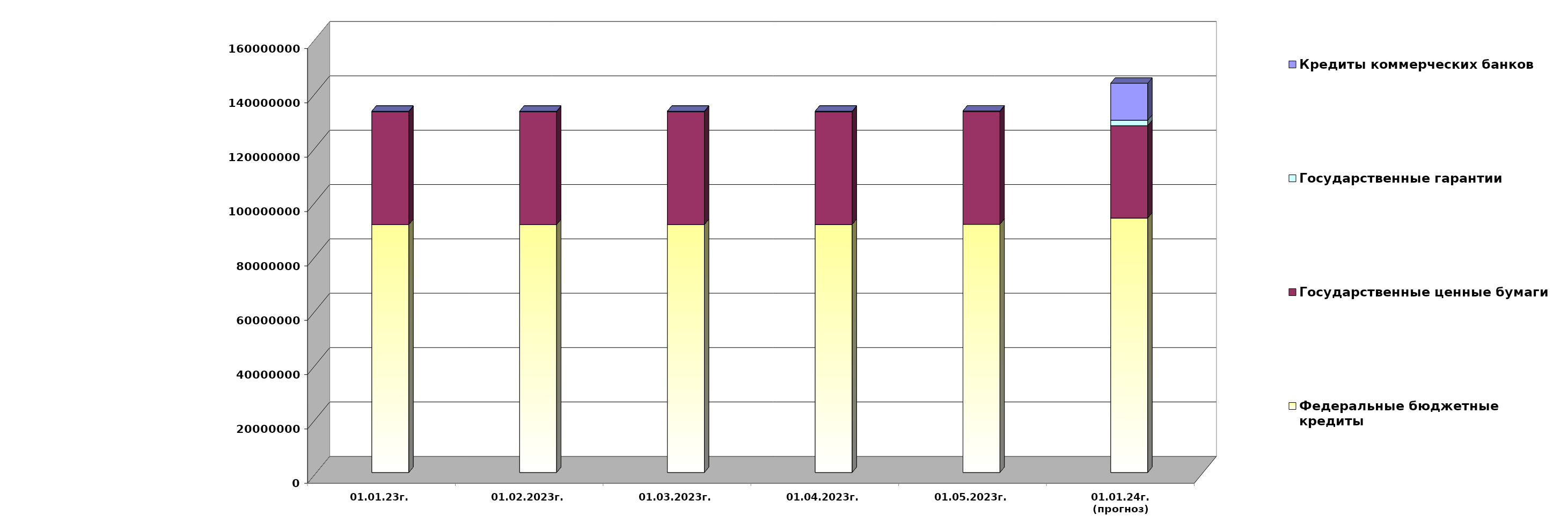
| Category | Федеральные бюджетные кредиты | Государственные ценные бумаги  | Государственные гарантии | Кредиты коммерческих банков |
|---|---|---|---|---|
| 01.01.23г. | 91228290.06 | 41500000 | 219957.743 | 0 |
| 01.02.2023г. | 91228290.06 | 41500000 | 217186.67 | 0 |
| 01.03.2023г. | 91228290.06 | 41500000 | 217186.67 | 0 |
| 01.04.2023г. | 91246617.843 | 41500000 | 218702.544 | 0 |
| 01.05.2023г. | 91334953.062 | 41500000 | 216632.858 | 0 |
| 01.01.24г.
(прогноз) | 93636248.9 | 34000000 | 2011427.8 | 13606594.9 |